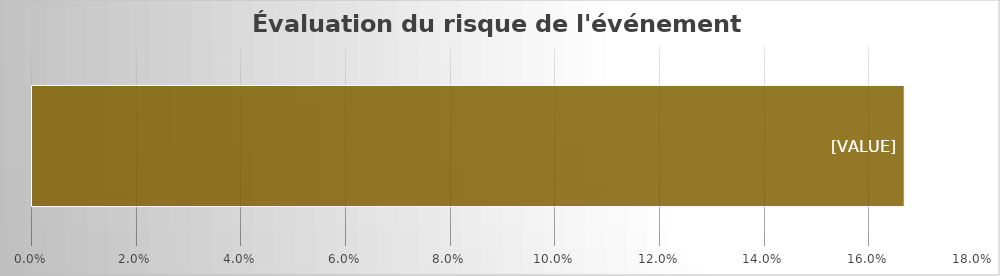
| Category | Évaluation du risque |
|---|---|
| 0 | 0.167 |